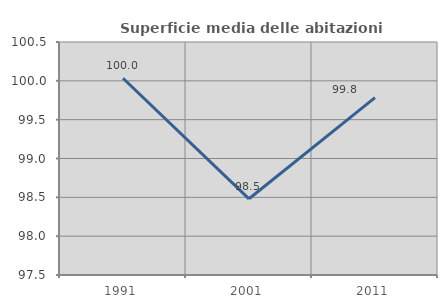
| Category | Superficie media delle abitazioni occupate |
|---|---|
| 1991.0 | 100.033 |
| 2001.0 | 98.481 |
| 2011.0 | 99.784 |